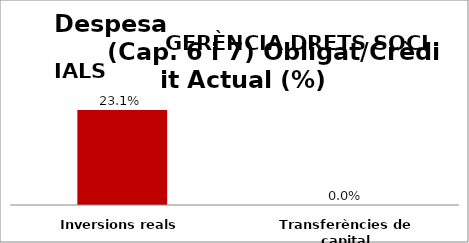
| Category | Series 0 |
|---|---|
| Inversions reals | 0.231 |
| Transferències de capital | 0 |